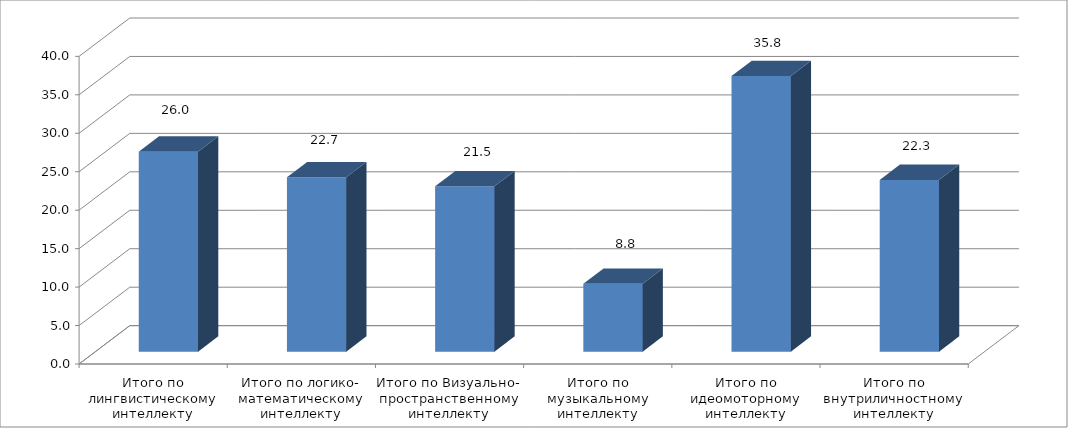
| Category | Series 0 |
|---|---|
| Итого по лингвистическому интеллекту | 26 |
| Итого по логико- математическому интеллекту | 22.667 |
| Итого по Визуально- пространственному интеллекту | 21.5 |
| Итого по музыкальному интеллекту | 8.833 |
| Итого по идеомоторному интеллекту | 35.833 |
| Итого по внутриличностному интеллекту | 22.333 |